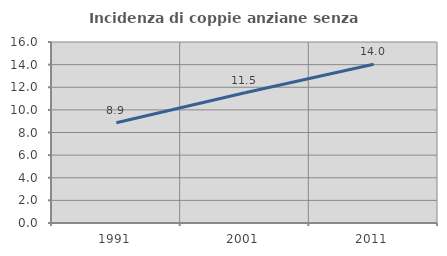
| Category | Incidenza di coppie anziane senza figli  |
|---|---|
| 1991.0 | 8.869 |
| 2001.0 | 11.52 |
| 2011.0 | 14.039 |